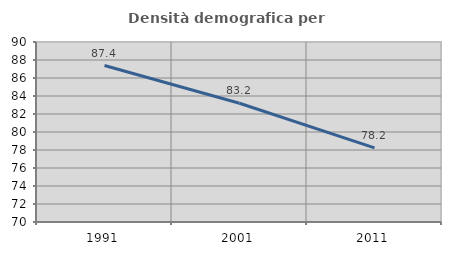
| Category | Densità demografica |
|---|---|
| 1991.0 | 87.383 |
| 2001.0 | 83.192 |
| 2011.0 | 78.242 |